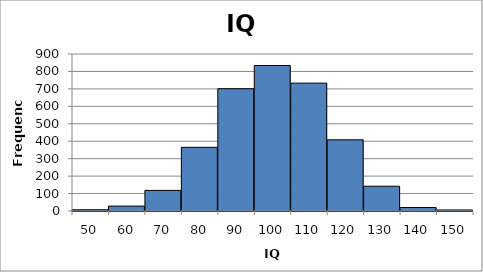
| Category | Series 0 |
|---|---|
| 50.0 | 7 |
| 60.0 | 28 |
| 70.0 | 118 |
| 80.0 | 365 |
| 90.0 | 701 |
| 100.0 | 834 |
| 110.0 | 733 |
| 120.0 | 408 |
| 130.0 | 142 |
| 140.0 | 20 |
| 150.0 | 6 |